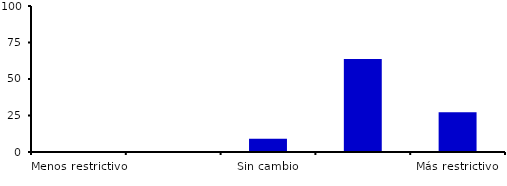
| Category | Series 0 |
|---|---|
| Menos restrictivo | 0 |
| Moderadamente menos restrictivo | 0 |
| Sin cambio | 9.091 |
| Moderadamente más restrictivo | 63.636 |
| Más restrictivo | 27.273 |